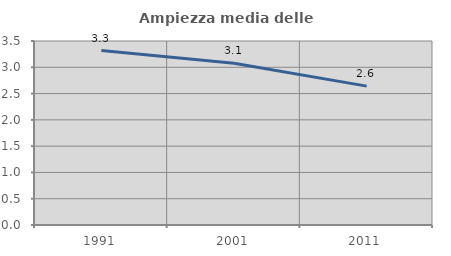
| Category | Ampiezza media delle famiglie |
|---|---|
| 1991.0 | 3.318 |
| 2001.0 | 3.077 |
| 2011.0 | 2.642 |